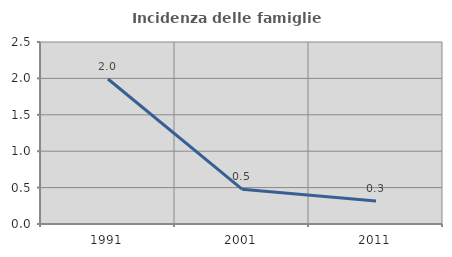
| Category | Incidenza delle famiglie numerose |
|---|---|
| 1991.0 | 1.991 |
| 2001.0 | 0.478 |
| 2011.0 | 0.317 |